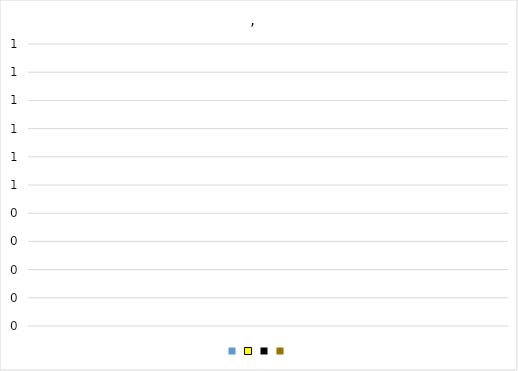
| Category | Series 0 | Series 1 | Series 2 | Series 9 |
|---|---|---|---|---|
| 0 | 0 | 0 | 0 | 0 |